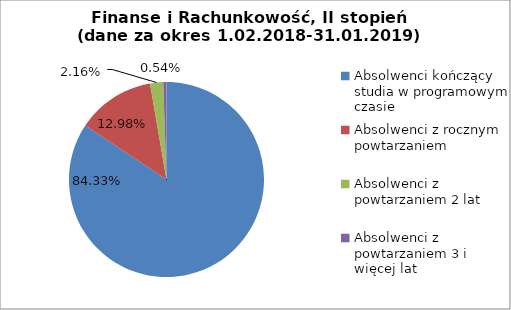
| Category | Series 0 |
|---|---|
| Absolwenci kończący studia w programowym czasie | 84.324 |
| Absolwenci z rocznym powtarzaniem | 12.973 |
| Absolwenci z powtarzaniem 2 lat | 2.162 |
| Absolwenci z powtarzaniem 3 i więcej lat | 0.541 |